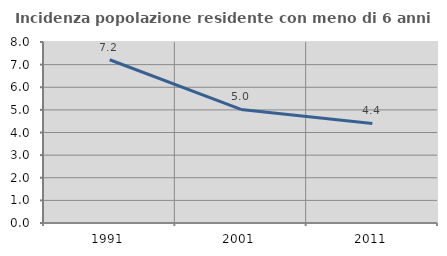
| Category | Incidenza popolazione residente con meno di 6 anni |
|---|---|
| 1991.0 | 7.216 |
| 2001.0 | 5.018 |
| 2011.0 | 4.4 |